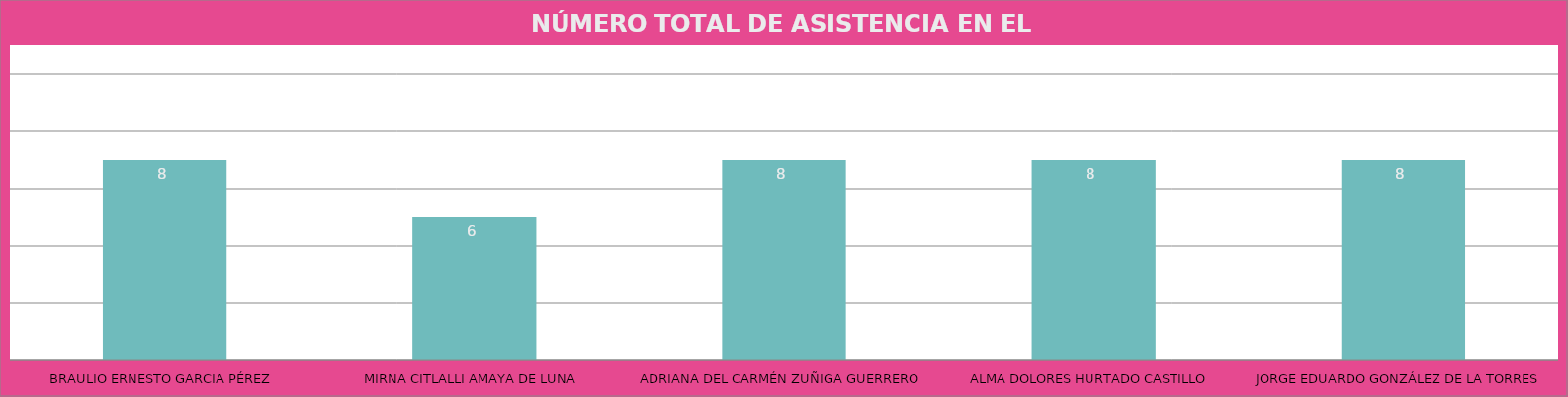
| Category | BRAULIO ERNESTO GARCIA PÉREZ |
|---|---|
| BRAULIO ERNESTO GARCIA PÉREZ | 8 |
| MIRNA CITLALLI AMAYA DE LUNA | 6 |
| ADRIANA DEL CARMÉN ZUÑIGA GUERRERO | 8 |
| ALMA DOLORES HURTADO CASTILLO | 8 |
| JORGE EDUARDO GONZÁLEZ DE LA TORRES | 8 |